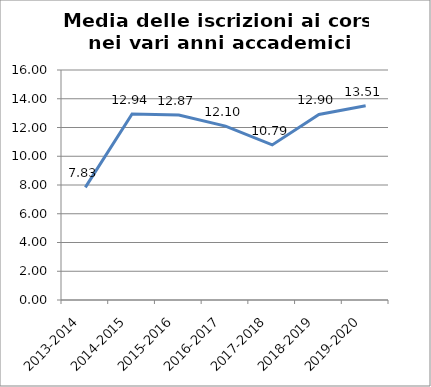
| Category | Media delle iscrizioni ai Corsi |
|---|---|
| 2013-2014 | 7.833 |
| 2014-2015 | 12.935 |
| 2015-2016 | 12.87 |
| 2016-2017 | 12.098 |
| 2017-2018 | 10.787 |
| 2018-2019 | 12.905 |
| 2019-2020 | 13.509 |